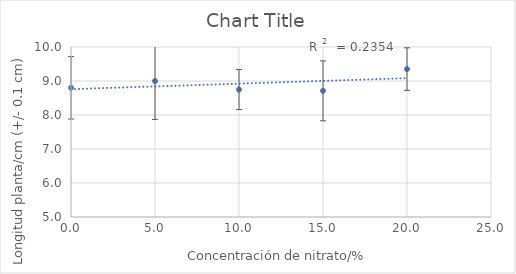
| Category | Series 0 |
|---|---|
| 0.0 | 8.8 |
| 5.0 | 9 |
| 10.0 | 8.75 |
| 15.0 | 8.71 |
| 20.0 | 9.35 |